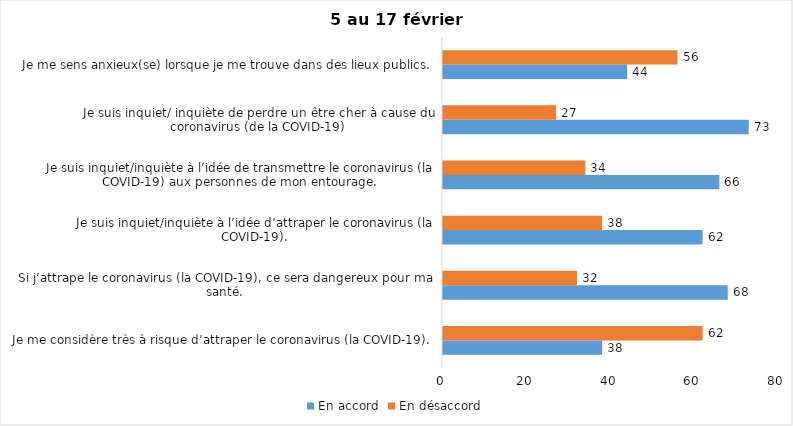
| Category | En accord | En désaccord |
|---|---|---|
| Je me considère très à risque d’attraper le coronavirus (la COVID-19). | 38 | 62 |
| Si j’attrape le coronavirus (la COVID-19), ce sera dangereux pour ma santé. | 68 | 32 |
| Je suis inquiet/inquiète à l’idée d’attraper le coronavirus (la COVID-19). | 62 | 38 |
| Je suis inquiet/inquiète à l’idée de transmettre le coronavirus (la COVID-19) aux personnes de mon entourage. | 66 | 34 |
| Je suis inquiet/ inquiète de perdre un être cher à cause du coronavirus (de la COVID-19) | 73 | 27 |
| Je me sens anxieux(se) lorsque je me trouve dans des lieux publics. | 44 | 56 |